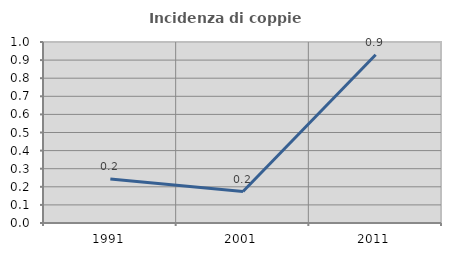
| Category | Incidenza di coppie miste |
|---|---|
| 1991.0 | 0.243 |
| 2001.0 | 0.174 |
| 2011.0 | 0.929 |